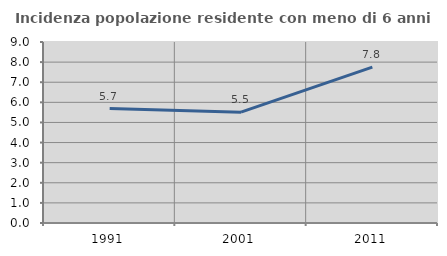
| Category | Incidenza popolazione residente con meno di 6 anni |
|---|---|
| 1991.0 | 5.689 |
| 2001.0 | 5.511 |
| 2011.0 | 7.752 |